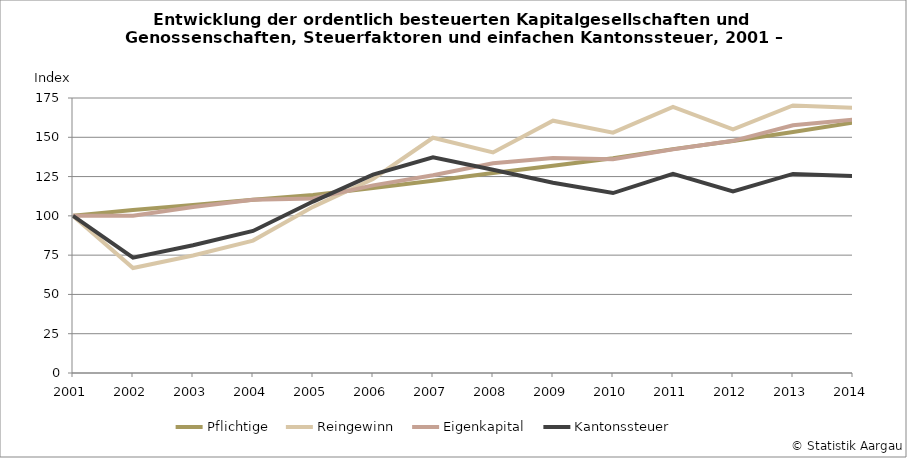
| Category | Pflichtige | Reingewinn | Eigenkapital | Kantonssteuer |
|---|---|---|---|---|
| 2001.0 | 100 | 100 | 100 | 100 |
| 2002.0 | 103.794 | 66.834 | 100.134 | 73.431 |
| 2003.0 | 106.937 | 74.805 | 105.608 | 81.336 |
| 2004.0 | 110.316 | 84.249 | 110.188 | 90.384 |
| 2005.0 | 113.301 | 105.719 | 111.087 | 109.093 |
| 2006.0 | 117.696 | 123.442 | 119.384 | 126.237 |
| 2007.0 | 122.314 | 149.719 | 125.817 | 137.191 |
| 2008.0 | 127.289 | 140.379 | 133.471 | 129.365 |
| 2009.0 | 131.935 | 160.555 | 136.756 | 121.106 |
| 2010.0 | 136.703 | 152.94 | 136.021 | 114.509 |
| 2011.0 | 142.458 | 169.327 | 142.292 | 126.734 |
| 2012.0 | 147.67 | 155.063 | 147.747 | 115.572 |
| 2013.0 | 153.404 | 170.237 | 157.692 | 126.693 |
| 2014.0 | 159.31 | 168.766 | 161.209 | 125.265 |